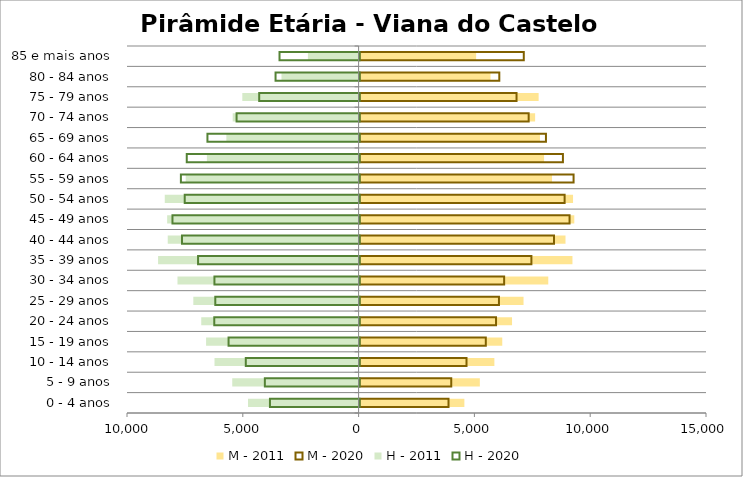
| Category | M - 2011 | M - 2020 | H - 2011 | H - 2020 |
|---|---|---|---|---|
| 0 - 4 anos | 4524 | 3839 | -4775 | -3871 |
| 5 - 9 anos | 5192 | 3957 | -5456 | -4091 |
| 10 - 14 anos | 5820 | 4616 | -6221 | -4914 |
| 15 - 19 anos | 6160 | 5449 | -6585 | -5658 |
| 20 - 24 anos | 6582 | 5891 | -6794 | -6275 |
| 25 - 29 anos | 7079 | 6017 | -7136 | -6231 |
| 30 - 34 anos | 8147 | 6241 | -7820 | -6268 |
| 35 - 39 anos | 9191 | 7418 | -8658 | -6975 |
| 40 - 44 anos | 8891 | 8394 | -8240 | -7669 |
| 45 - 49 anos | 9270 | 9065 | -8266 | -8080 |
| 50 - 54 anos | 9216 | 8852 | -8369 | -7551 |
| 55 - 59 anos | 8309 | 9239 | -7465 | -7716 |
| 60 - 64 anos | 7966 | 8779 | -6550 | -7463 |
| 65 - 69 anos | 7788 | 8046 | -5710 | -6570 |
| 70 - 74 anos | 7579 | 7300 | -5436 | -5312 |
| 75 - 79 anos | 7731 | 6776 | -5021 | -4335 |
| 80 - 84 anos | 5652 | 6032 | -3330 | -3629 |
| 85 e mais anos | 5032 | 7089 | -2188 | -3458 |